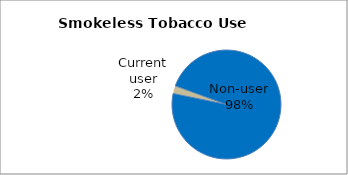
| Category | Series 0 |
|---|---|
| Non-user | 97.679 |
| Current user | 2.321 |